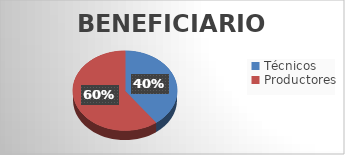
| Category | Series 0 |
|---|---|
| Técnicos | 119 |
| Productores | 180 |